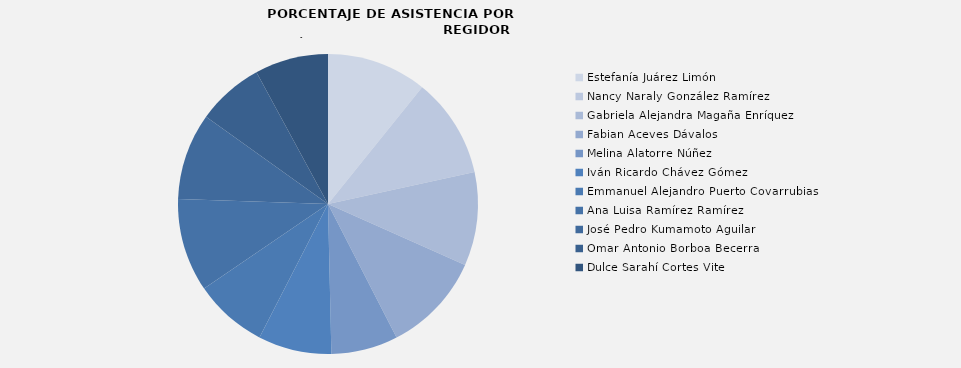
| Category | Estefanía Juárez Limón  |
|---|---|
| Estefanía Juárez Limón  | 100 |
| Nancy Naraly González Ramírez | 100 |
| Gabriela Alejandra Magaña Enríquez | 93.333 |
| Fabian Aceves Dávalos | 100 |
| Melina Alatorre Núñez | 66.667 |
| Iván Ricardo Chávez Gómez | 73.333 |
| Emmanuel Alejandro Puerto Covarrubias | 73.333 |
| Ana Luisa Ramírez Ramírez | 93.333 |
| José Pedro Kumamoto Aguilar | 86.667 |
| Omar Antonio Borboa Becerra | 66.667 |
| Dulce Sarahí Cortes Vite | 73.333 |